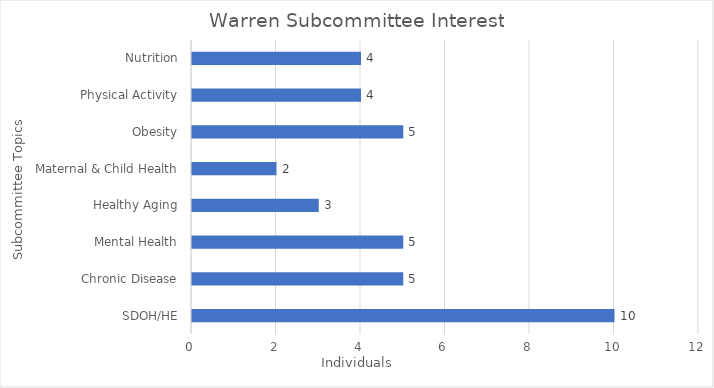
| Category | Series 0 |
|---|---|
| SDOH/HE | 10 |
| Chronic Disease | 5 |
| Mental Health | 5 |
| Healthy Aging | 3 |
| Maternal & Child Health | 2 |
| Obesity | 5 |
| Physical Activity | 4 |
| Nutrition | 4 |